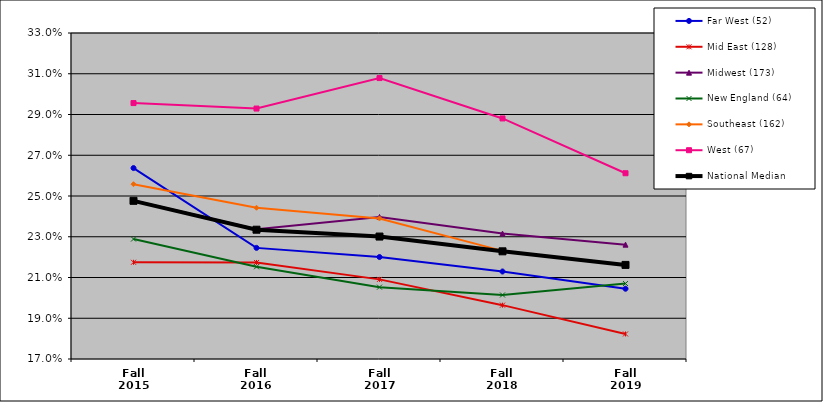
| Category | Far West (52) | Mid East (128) | Midwest (173) | New England (64) | Southeast (162) | West (67) | National Median |
|---|---|---|---|---|---|---|---|
| Fall 2015 | 0.264 | 0.217 | 0.248 | 0.229 | 0.256 | 0.296 | 0.248 |
| Fall 2016 | 0.225 | 0.217 | 0.234 | 0.215 | 0.244 | 0.293 | 0.233 |
| Fall 2017 | 0.22 | 0.209 | 0.24 | 0.205 | 0.239 | 0.308 | 0.23 |
| Fall 2018 | 0.213 | 0.196 | 0.232 | 0.201 | 0.223 | 0.288 | 0.223 |
| Fall 2019 | 0.204 | 0.182 | 0.226 | 0.207 | 0.216 | 0.261 | 0.216 |